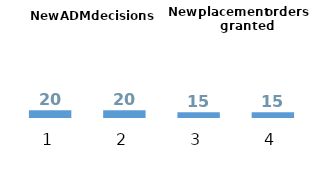
| Category | LA |
|---|---|
| 0 | 20 |
| 1 | 20 |
| 2 | 15 |
| 3 | 15 |